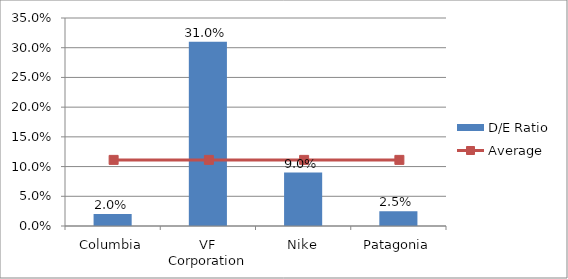
| Category | D/E Ratio |
|---|---|
| Columbia | 0.02 |
| VF Corporation | 0.31 |
| Nike | 0.09 |
| Patagonia | 0.025 |